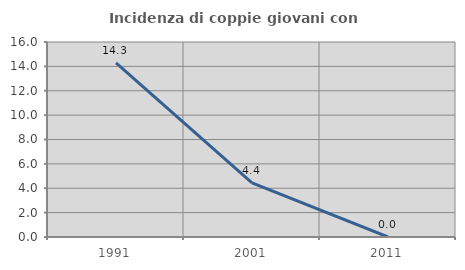
| Category | Incidenza di coppie giovani con figli |
|---|---|
| 1991.0 | 14.286 |
| 2001.0 | 4.444 |
| 2011.0 | 0 |